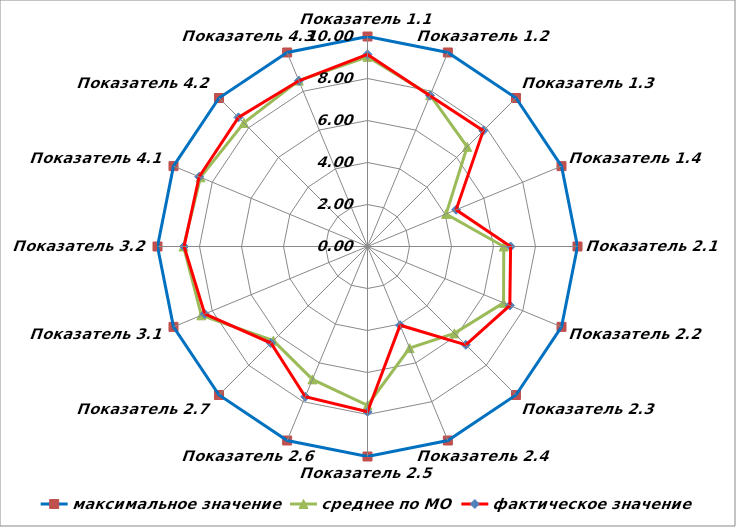
| Category | максимальное значение | среднее по МО | фактическое значение |
|---|---|---|---|
| Показатель 1.1 | 10 | 9.033 | 9.148 |
| Показатель 1.2 | 10 | 7.803 | 7.776 |
| Показатель 1.3 | 10 | 6.713 | 7.796 |
| Показатель 1.4 | 10 | 4.051 | 4.567 |
| Показатель 2.1 | 10 | 6.489 | 6.814 |
| Показатель 2.2 | 10 | 7.011 | 7.336 |
| Показатель 2.3 | 10 | 5.851 | 6.623 |
| Показатель 2.4 | 10 | 5.239 | 4.057 |
| Показатель 2.5 | 10 | 7.56 | 7.872 |
| Показатель 2.6 | 10 | 6.849 | 7.744 |
| Показатель 2.7 | 10 | 6.342 | 6.502 |
| Показатель 3.1 | 10 | 8.563 | 8.389 |
| Показатель 3.2 | 10 | 8.76 | 8.735 |
| Показатель 4.1 | 10 | 8.608 | 8.677 |
| Показатель 4.2 | 10 | 8.323 | 8.69 |
| Показатель 4.3 | 10 | 8.551 | 8.539 |